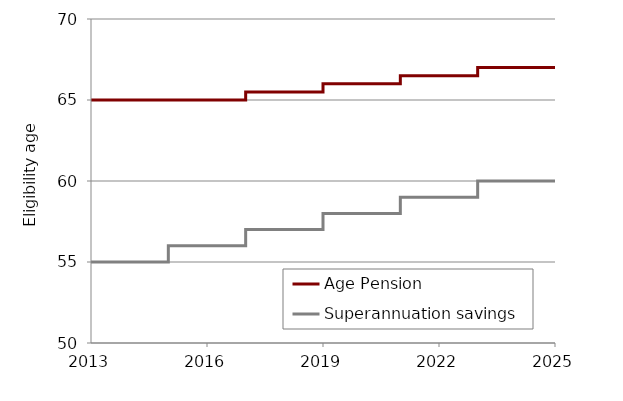
| Category | Age Pension  | Superannuation savings |
|---|---|---|
| 2013.0 | 65 | 55 |
| 2014.0 | 65 | 55 |
| 2015.0 | 65 | 55 |
| 2015.0 | 65 | 56 |
| 2016.0 | 65 | 56 |
| 2016.0 | 65 | 56 |
| 2017.0 | 65 | 56 |
| 2017.0 | 65.5 | 57 |
| 2018.0 | 65.5 | 57 |
| 2018.0 | 65.5 | 57 |
| 2019.0 | 65.5 | 57 |
| 2019.0 | 66 | 58 |
| 2020.0 | 66 | 58 |
| 2020.0 | 66 | 58 |
| 2021.0 | 66 | 58 |
| 2021.0 | 66.5 | 59 |
| 2022.0 | 66.5 | 59 |
| 2022.0 | 66.5 | 59 |
| 2023.0 | 66.5 | 59 |
| 2023.0 | 67 | 60 |
| 2024.0 | 67 | 60 |
| 2024.0 | 67 | 60 |
| 2025.0 | 67 | 60 |
| 2025.0 | 67 | 60 |